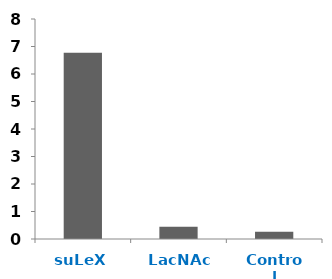
| Category | Series 0 |
|---|---|
| suLeX | 6.77 |
| LacNAc | 0.45 |
| Control | 0.265 |